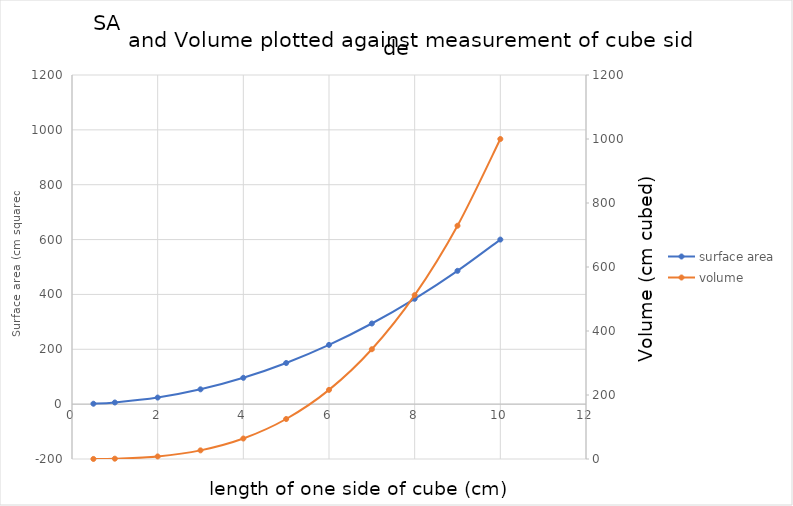
| Category | surface area |
|---|---|
| 0.5 | 1.5 |
| 1.0 | 6 |
| 2.0 | 24 |
| 3.0 | 54 |
| 4.0 | 96 |
| 5.0 | 150 |
| 6.0 | 216 |
| 7.0 | 294 |
| 8.0 | 384 |
| 9.0 | 486 |
| 10.0 | 600 |